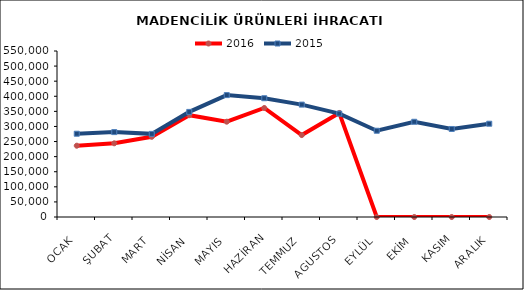
| Category | 2016 | 2015 |
|---|---|---|
| OCAK | 236204.636 | 275911.1 |
| ŞUBAT | 244178.066 | 281267.109 |
| MART | 265659.72 | 275441.421 |
| NİSAN | 337256.002 | 348218.356 |
| MAYIS | 315766.939 | 403889.405 |
| HAZİRAN | 361177.881 | 393504.76 |
| TEMMUZ | 271405.364 | 372407.653 |
| AGUSTOS | 344754.381 | 342593.82 |
| EYLÜL | 0 | 285769.358 |
| EKİM | 0 | 315506.201 |
| KASIM | 0 | 291654.31 |
| ARALIK | 0 | 309047.221 |